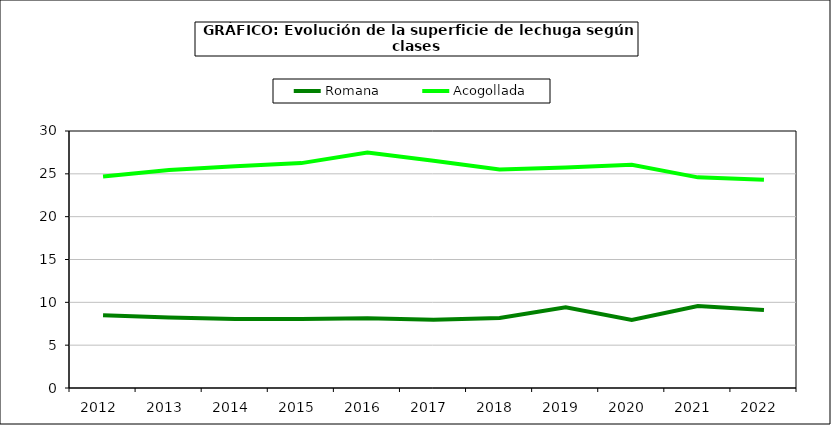
| Category | Romana | Acogollada |
|---|---|---|
| 2012.0 | 8.497 | 24.699 |
| 2013.0 | 8.23 | 25.438 |
| 2014.0 | 8.041 | 25.883 |
| 2015.0 | 8.063 | 26.251 |
| 2016.0 | 8.145 | 27.501 |
| 2017.0 | 7.972 | 26.536 |
| 2018.0 | 8.166 | 25.508 |
| 2019.0 | 9.434 | 25.734 |
| 2020.0 | 7.956 | 26.049 |
| 2021.0 | 9.56 | 24.59 |
| 2022.0 | 9.11 | 24.301 |